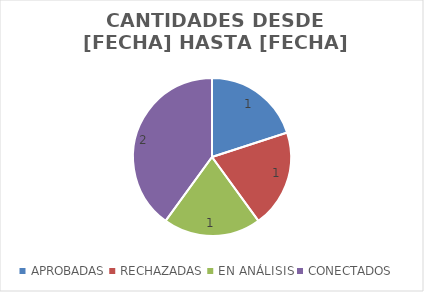
| Category | Series 0 |
|---|---|
| APROBADAS | 1 |
| RECHAZADAS | 1 |
| EN ANÁLISIS | 1 |
| CONECTADOS | 2 |